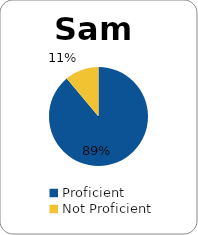
| Category | Series 0 |
|---|---|
| Proficient | 0.889 |
| Not Proficient | 0.111 |